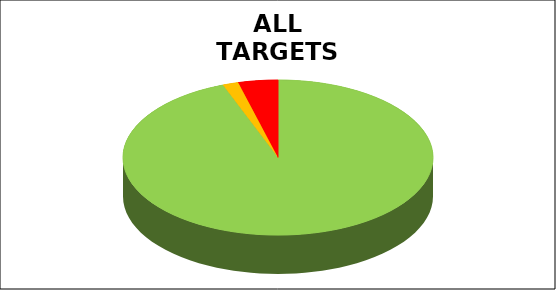
| Category | Series 0 |
|---|---|
| Green | 0.942 |
| Amber | 0.017 |
| Red | 0.041 |